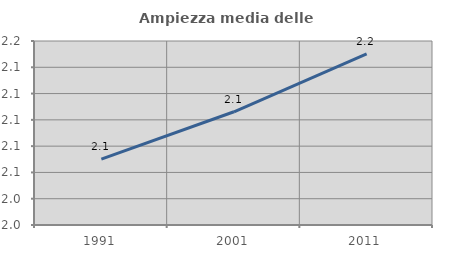
| Category | Ampiezza media delle famiglie |
|---|---|
| 1991.0 | 2.07 |
| 2001.0 | 2.106 |
| 2011.0 | 2.15 |